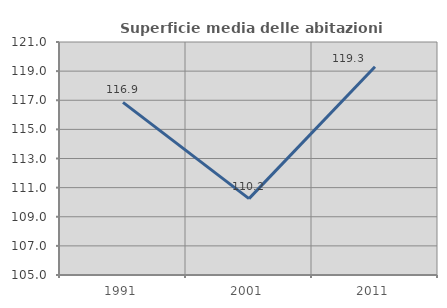
| Category | Superficie media delle abitazioni occupate |
|---|---|
| 1991.0 | 116.856 |
| 2001.0 | 110.242 |
| 2011.0 | 119.297 |